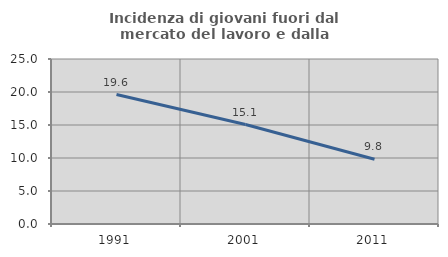
| Category | Incidenza di giovani fuori dal mercato del lavoro e dalla formazione  |
|---|---|
| 1991.0 | 19.617 |
| 2001.0 | 15.074 |
| 2011.0 | 9.804 |